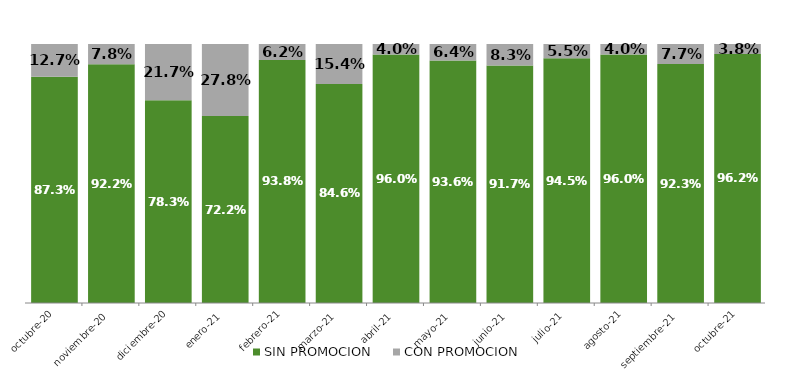
| Category | SIN PROMOCION   | CON PROMOCION   |
|---|---|---|
| 2020-10-01 | 0.873 | 0.127 |
| 2020-11-01 | 0.922 | 0.078 |
| 2020-12-01 | 0.783 | 0.217 |
| 2021-01-01 | 0.722 | 0.278 |
| 2021-02-01 | 0.938 | 0.062 |
| 2021-03-01 | 0.846 | 0.154 |
| 2021-04-01 | 0.96 | 0.04 |
| 2021-05-01 | 0.936 | 0.064 |
| 2021-06-01 | 0.917 | 0.083 |
| 2021-07-01 | 0.945 | 0.055 |
| 2021-08-01 | 0.96 | 0.04 |
| 2021-09-01 | 0.923 | 0.077 |
| 2021-10-01 | 0.962 | 0.038 |